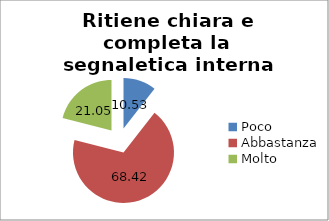
| Category | Ritiene chiara e completa la segnaletica interna dell'ospedale? |
|---|---|
| Poco | 10.526 |
| Abbastanza | 68.421 |
| Molto | 21.053 |